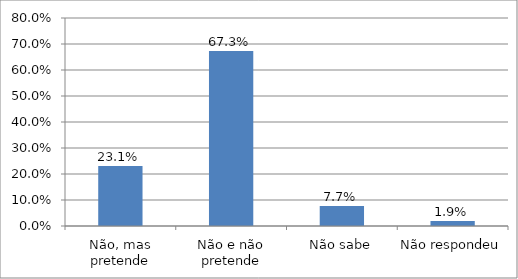
| Category | Series 0 |
|---|---|
| Não, mas pretende | 0.231 |
| Não e não pretende | 0.673 |
| Não sabe | 0.077 |
| Não respondeu | 0.019 |